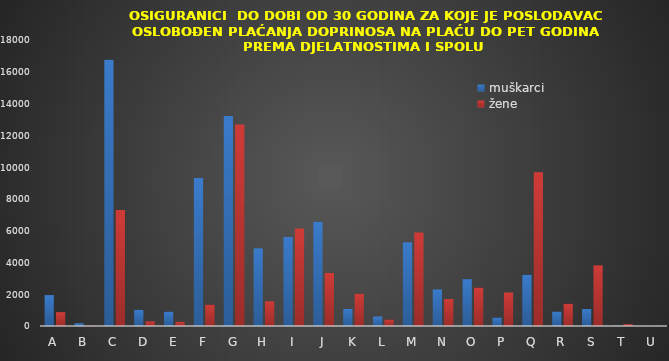
| Category | muškarci | žene |
|---|---|---|
| A | 1945 | 873 |
| B | 170 | 21 |
| C | 16762 | 7306 |
| D | 1012 | 296 |
| E | 901 | 266 |
| F | 9308 | 1340 |
| G | 13218 | 12689 |
| H | 4887 | 1553 |
| I | 5606 | 6140 |
| J | 6567 | 3335 |
| K | 1070 | 2028 |
| L | 598 | 408 |
| M | 5268 | 5892 |
| N | 2301 | 1698 |
| O | 2946 | 2419 |
| P | 530 | 2111 |
| Q | 3220 | 9678 |
| R | 908 | 1399 |
| S | 1068 | 3817 |
| T | 21 | 117 |
| U | 8 | 10 |